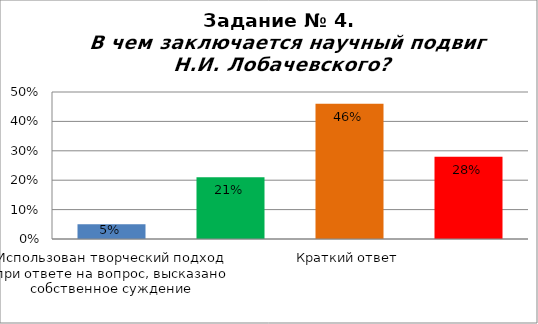
| Category | В чем заключается научный подвиг Н.И. Лобачевского? |
|---|---|
| Использован творческий подход при ответе на вопрос, высказано собственное суждение | 0.05 |
| При ответе на вопрос использованы материалы текста, без собственной оценки событий | 0.21 |
| Краткий ответ | 0.46 |
| Неверный ответ или не приступал | 0.28 |